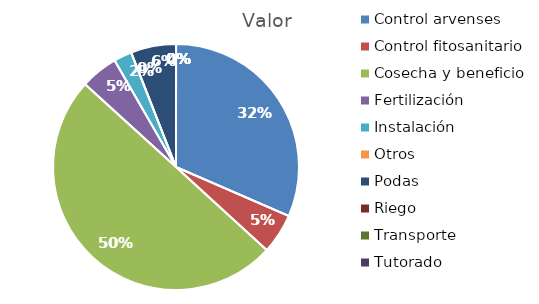
| Category | Valor |
|---|---|
| Control arvenses | 55397194 |
| Control fitosanitario | 9281250 |
| Cosecha y beneficio | 87801120 |
| Fertilización | 8662500 |
| Instalación | 4175417 |
| Otros | 0 |
| Podas | 10450000 |
| Riego | 0 |
| Transporte | 0 |
| Tutorado | 0 |